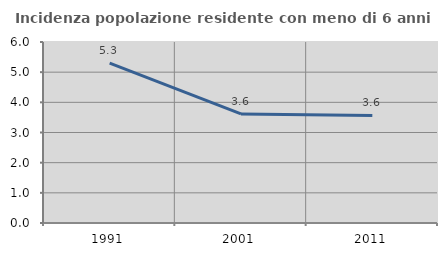
| Category | Incidenza popolazione residente con meno di 6 anni |
|---|---|
| 1991.0 | 5.297 |
| 2001.0 | 3.617 |
| 2011.0 | 3.567 |